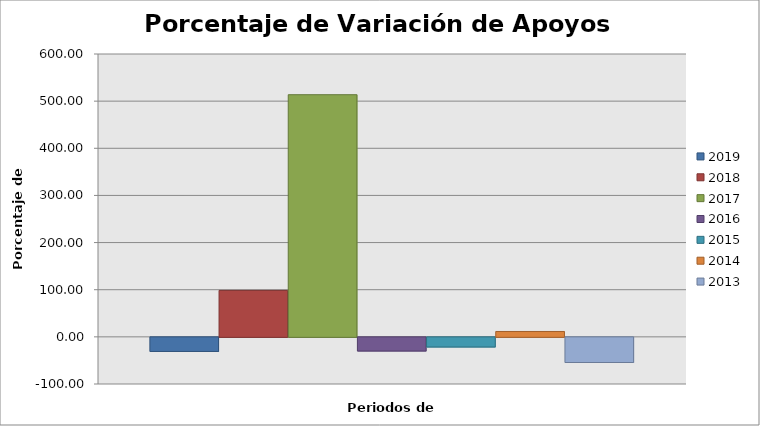
| Category | 2019 | 2018 | 2017 | 2016 | 2015 | 2014 | 2013 |
|---|---|---|---|---|---|---|---|
| 0 | -29.851 | 98.519 | 513.636 | -29.032 | -20.513 | 11.429 | -53.333 |